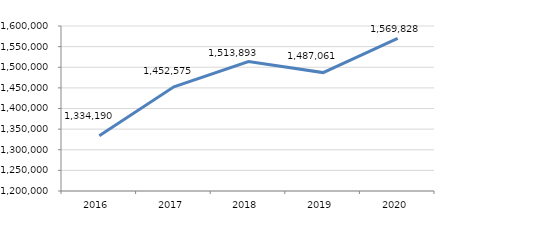
| Category | Series 0 |
|---|---|
| 2016.0 | 1334190 |
| 2017.0 | 1452575 |
| 2018.0 | 1513893 |
| 2019.0 | 1487061.28 |
| 2020.0 | 1569828.12 |